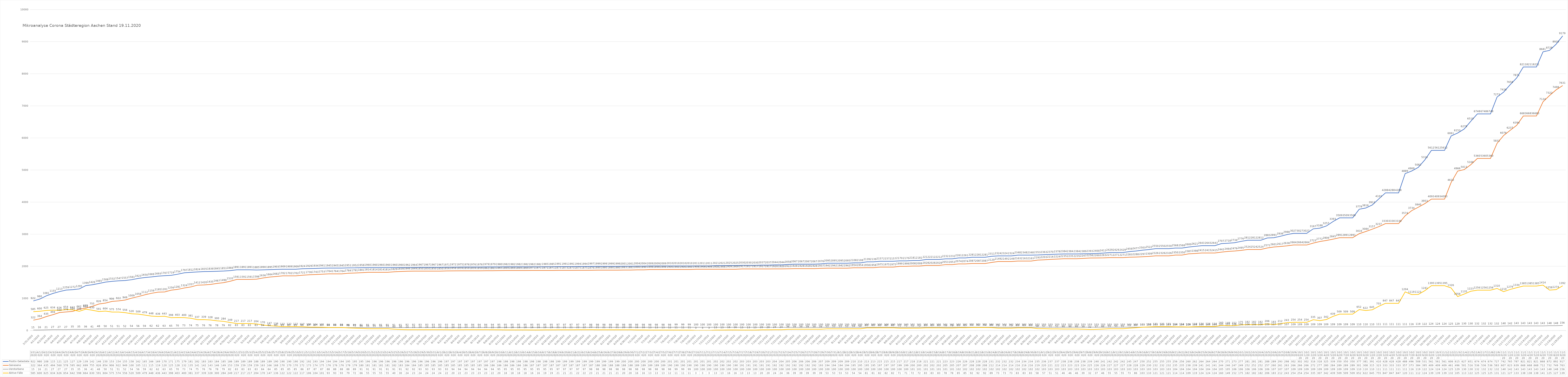
| Category | Positiv Getestete | Genesene | Verstorbene | Aktive Fälle |
|---|---|---|---|---|
| 3/31/20 | 922 | 322 | 15 | 585 |
| 4/1/20 | 980 | 364 | 16 | 600 |
| 4/2/20 | 1081 | 435 | 21 | 625 |
| 4/3/20 | 1155 | 494 | 27 | 634 |
| 4/4/20 | 1213 | 560 | 27 | 626 |
| 4/5/20 | 1259 | 578 | 27 | 654 |
| 4/6/20 | 1272 | 595 | 35 | 642 |
| 4/7/20 | 1295 | 662 | 35 | 598 |
| 4/8/20 | 1399 | 699 | 36 | 664 |
| 4/9/20 | 1426 | 755 | 41 | 630 |
| 4/10/20 | 1465 | 826 | 48 | 591 |
| 4/11/20 | 1508 | 854 | 50 | 604 |
| 4/12/20 | 1532 | 906 | 51 | 575 |
| 4/13/20 | 1547 | 922 | 51 | 574 |
| 4/14/20 | 1557 | 949 | 52 | 556 |
| 4/15/20 | 1583 | 1009 | 54 | 520 |
| 4/16/20 | 1623 | 1058 | 56 | 509 |
| 4/17/20 | 1650 | 1112 | 59 | 479 |
| 4/18/20 | 1669 | 1159 | 62 | 448 |
| 4/19/20 | 1693 | 1195 | 62 | 436 |
| 4/20/20 | 1707 | 1201 | 63 | 443 |
| 4/21/20 | 1719 | 1256 | 65 | 398 |
| 4/22/20 | 1754 | 1281 | 70 | 403 |
| 4/23/20 | 1797 | 1324 | 73 | 400 |
| 4/24/20 | 1812 | 1357 | 74 | 381 |
| 4/25/20 | 1824 | 1412 | 75 | 337 |
| 4/26/20 | 1835 | 1420 | 76 | 339 |
| 4/27/20 | 1839 | 1435 | 76 | 328 |
| 4/28/20 | 1845 | 1467 | 78 | 300 |
| 4/29/20 | 1853 | 1490 | 79 | 284 |
| 4/30/20 | 1866 | 1535 | 82 | 249 |
| 5/1/20 | 1891 | 1591 | 83 | 217 |
| 5/2/20 | 1891 | 1591 | 83 | 217 |
| 5/3/20 | 1891 | 1591 | 83 | 217 |
| 5/4/20 | 1885 | 1598 | 83 | 204 |
| 5/5/20 | 1890 | 1636 | 84 | 170 |
| 5/6/20 | 1895 | 1664 | 84 | 147 |
| 5/7/20 | 1903 | 1682 | 85 | 136 |
| 5/8/20 | 1909 | 1702 | 85 | 122 |
| 5/9/20 | 1909 | 1702 | 85 | 122 |
| 5/10/20 | 1909 | 1702 | 85 | 122 |
| 5/11/20 | 1924 | 1721 | 86 | 117 |
| 5/12/20 | 1929 | 1736 | 87 | 106 |
| 5/13/20 | 1934 | 1743 | 87 | 104 |
| 5/14/20 | 1941 | 1753 | 87 | 101 |
| 5/15/20 | 1945 | 1764 | 88 | 93 |
| 5/16/20 | 1945 | 1764 | 88 | 93 |
| 5/17/20 | 1945 | 1764 | 88 | 93 |
| 5/18/20 | 1951 | 1784 | 88 | 79 |
| 5/19/20 | 1952 | 1791 | 89 | 72 |
| 5/20/20 | 1958 | 1801 | 91 | 66 |
| 5/21/20 | 1960 | 1814 | 91 | 55 |
| 5/22/20 | 1960 | 1814 | 91 | 55 |
| 5/23/20 | 1960 | 1814 | 91 | 55 |
| 5/24/20 | 1960 | 1814 | 91 | 55 |
| 5/25/20 | 1960 | 1829 | 91 | 40 |
| 5/26/20 | 1960 | 1839 | 91 | 30 |
| 5/27/20 | 1962 | 1846 | 92 | 24 |
| 5/28/20 | 1964 | 1849 | 92 | 23 |
| 5/29/20 | 1967 | 1850 | 93 | 24 |
| 5/30/20 | 1967 | 1850 | 93 | 24 |
| 5/31/20 | 1967 | 1850 | 93 | 24 |
| 6/1/20 | 1967 | 1850 | 93 | 24 |
| 6/2/20 | 1971 | 1856 | 93 | 22 |
| 6/3/20 | 1972 | 1858 | 94 | 20 |
| 6/4/20 | 1975 | 1859 | 94 | 22 |
| 6/5/20 | 1976 | 1859 | 94 | 23 |
| 6/6/20 | 1976 | 1859 | 94 | 23 |
| 6/7/20 | 1976 | 1859 | 94 | 23 |
| 6/8/20 | 1979 | 1862 | 94 | 23 |
| 6/9/20 | 1979 | 1863 | 94 | 22 |
| 6/10/20 | 1980 | 1865 | 95 | 20 |
| 6/11/20 | 1982 | 1869 | 95 | 18 |
| 6/12/20 | 1982 | 1869 | 95 | 18 |
| 6/13/20 | 1982 | 1869 | 95 | 18 |
| 6/14/20 | 1982 | 1869 | 95 | 18 |
| 6/15/20 | 1982 | 1871 | 95 | 16 |
| 6/16/20 | 1982 | 1871 | 95 | 16 |
| 6/17/20 | 1985 | 1871 | 95 | 19 |
| 6/18/20 | 1985 | 1871 | 95 | 19 |
| 6/19/20 | 1991 | 1873 | 97 | 21 |
| 6/20/20 | 1991 | 1873 | 97 | 21 |
| 6/21/20 | 1991 | 1873 | 97 | 21 |
| 6/22/20 | 1994 | 1875 | 97 | 22 |
| 6/23/20 | 1994 | 1875 | 97 | 22 |
| 6/24/20 | 1997 | 1876 | 98 | 23 |
| 6/25/20 | 1999 | 1880 | 98 | 21 |
| 6/26/20 | 1999 | 1880 | 98 | 21 |
| 6/27/20 | 1999 | 1880 | 98 | 21 |
| 6/28/20 | 1999 | 1880 | 98 | 21 |
| 6/29/20 | 2001 | 1883 | 98 | 20 |
| 6/30/20 | 2001 | 1883 | 98 | 20 |
| 7/1/20 | 2004 | 1890 | 98 | 16 |
| 7/2/20 | 2004 | 1890 | 98 | 16 |
| 7/3/20 | 2009 | 1898 | 98 | 13 |
| 7/4/20 | 2009 | 1898 | 98 | 13 |
| 7/5/20 | 2009 | 1898 | 98 | 13 |
| 7/6/20 | 2010 | 1900 | 98 | 12 |
| 7/7/20 | 2010 | 1900 | 99 | 11 |
| 7/8/20 | 2010 | 1900 | 99 | 11 |
| 7/9/20 | 2010 | 1900 | 99 | 11 |
| 7/10/20 | 2011 | 1908 | 100 | 3 |
| 7/11/20 | 2011 | 1908 | 100 | 3 |
| 7/12/20 | 2011 | 1908 | 100 | 3 |
| 7/13/20 | 2021 | 1908 | 100 | 13 |
| 7/14/20 | 2021 | 1908 | 100 | 13 |
| 7/15/20 | 2025 | 1909 | 100 | 16 |
| 7/16/20 | 2025 | 1909 | 100 | 16 |
| 7/17/20 | 2030 | 1917 | 100 | 13 |
| 7/18/20 | 2030 | 1917 | 100 | 13 |
| 7/19/20 | 2030 | 1917 | 100 | 13 |
| 7/20/20 | 2037 | 1917 | 100 | 20 |
| 7/21/20 | 2037 | 1917 | 100 | 20 |
| 7/22/20 | 2044 | 1920 | 100 | 24 |
| 7/23/20 | 2044 | 1920 | 100 | 24 |
| 7/24/20 | 2058 | 1922 | 100 | 36 |
| 7/25/20 | 2067 | 1928 | 100 | 39 |
| 7/26/20 | 2067 | 1928 | 100 | 39 |
| 7/27/20 | 2067 | 1928 | 100 | 39 |
| 7/28/20 | 2067 | 1928 | 100 | 39 |
| 7/29/20 | 2076 | 1937 | 100 | 39 |
| 7/30/20 | 2095 | 1942 | 100 | 53 |
| 7/31/20 | 2095 | 1942 | 100 | 53 |
| 8/1/20 | 2095 | 1942 | 100 | 53 |
| 8/2/20 | 2095 | 1942 | 100 | 53 |
| 8/3/20 | 2108 | 1954 | 100 | 54 |
| 8/4/20 | 2108 | 1954 | 100 | 54 |
| 8/5/20 | 2139 | 1958 | 100 | 81 |
| 8/6/20 | 2139 | 1958 | 100 | 81 |
| 8/7/20 | 2157 | 1975 | 100 | 82 |
| 8/8/20 | 2157 | 1975 | 100 | 82 |
| 8/9/20 | 2157 | 1975 | 100 | 82 |
| 8/10/20 | 2170 | 1999 | 100 | 71 |
| 8/11/20 | 2170 | 1999 | 100 | 71 |
| 8/12/20 | 2181 | 2008 | 101 | 72 |
| 8/13/20 | 2181 | 2008 | 101 | 72 |
| 8/14/20 | 2212 | 2028 | 101 | 83 |
| 8/15/20 | 2212 | 2028 | 101 | 83 |
| 8/16/20 | 2212 | 2028 | 101 | 83 |
| 8/17/20 | 2232 | 2053 | 101 | 78 |
| 8/18/20 | 2232 | 2053 | 101 | 78 |
| 8/19/20 | 2261 | 2074 | 102 | 85 |
| 8/20/20 | 2261 | 2074 | 102 | 85 |
| 8/21/20 | 2281 | 2087 | 102 | 92 |
| 8/22/20 | 2281 | 2087 | 102 | 92 |
| 8/23/20 | 2281 | 2087 | 102 | 92 |
| 8/24/20 | 2311 | 2120 | 102 | 89 |
| 8/25/20 | 2324 | 2149 | 102 | 73 |
| 8/26/20 | 2324 | 2149 | 102 | 73 |
| 8/27/20 | 2324 | 2149 | 102 | 73 |
| 8/28/20 | 2348 | 2163 | 102 | 83 |
| 8/29/20 | 2348 | 2163 | 102 | 83 |
| 8/30/20 | 2348 | 2163 | 102 | 83 |
| 8/31/20 | 2353 | 2193 | 102 | 58 |
| 9/1/20 | 2363 | 2203 | 103 | 57 |
| 9/2/20 | 2370 | 2216 | 103 | 51 |
| 9/3/20 | 2378 | 2224 | 103 | 51 |
| 9/4/20 | 2384 | 2235 | 103 | 46 |
| 9/5/20 | 2384 | 2235 | 103 | 46 |
| 9/6/20 | 2384 | 2235 | 103 | 46 |
| 9/7/20 | 2389 | 2247 | 103 | 39 |
| 9/8/20 | 2393 | 2258 | 103 | 32 |
| 9/9/20 | 2400 | 2260 | 103 | 37 |
| 9/10/20 | 2412 | 2263 | 103 | 46 |
| 9/11/20 | 2429 | 2271 | 103 | 55 |
| 9/12/20 | 2429 | 2271 | 103 | 55 |
| 9/13/20 | 2429 | 2271 | 103 | 55 |
| 9/14/20 | 2459 | 2283 | 103 | 73 |
| 9/15/20 | 2477 | 2288 | 103 | 86 |
| 9/16/20 | 2503 | 2297 | 103 | 103 |
| 9/17/20 | 2522 | 2309 | 103 | 110 |
| 9/18/20 | 2550 | 2326 | 103 | 121 |
| 9/19/20 | 2550 | 2326 | 103 | 121 |
| 9/20/20 | 2550 | 2326 | 103 | 121 |
| 9/21/20 | 2568 | 2350 | 104 | 114 |
| 9/22/20 | 2568 | 2350 | 104 | 114 |
| 9/23/20 | 2600 | 2387 | 104 | 109 |
| 9/24/20 | 2621 | 2398 | 104 | 119 |
| 9/25/20 | 2643 | 2415 | 104 | 124 |
| 9/26/20 | 2643 | 2415 | 104 | 124 |
| 9/27/20 | 2643 | 2415 | 104 | 124 |
| 9/28/20 | 2707 | 2442 | 105 | 160 |
| 9/29/20 | 2718 | 2464 | 105 | 149 |
| 9/30/20 | 2734 | 2476 | 106 | 152 |
| 10/1/20 | 2776 | 2495 | 106 | 175 |
| 10/2/20 | 2812 | 2524 | 106 | 182 |
| 10/3/20 | 2812 | 2524 | 106 | 182 |
| 10/4/20 | 2812 | 2524 | 106 | 182 |
| 10/5/20 | 2883 | 2571 | 106 | 206 |
| 10/6/20 | 2891 | 2601 | 107 | 183 |
| 10/7/20 | 2936 | 2617 | 107 | 212 |
| 10/8/20 | 2988 | 2638 | 107 | 243 |
| 10/9/20 | 3027 | 2664 | 109 | 254 |
| 10/10/20 | 3027 | 2664 | 109 | 254 |
| 10/11/20 | 3027 | 2664 | 109 | 254 |
| 10/12/20 | 3167 | 2723 | 109 | 335 |
| 10/13/20 | 3188 | 2772 | 109 | 307 |
| 10/14/20 | 3257 | 2806 | 109 | 342 |
| 10/15/20 | 3393 | 2845 | 109 | 439 |
| 10/16/20 | 3509 | 2891 | 109 | 509 |
| 10/17/20 | 3509 | 2891 | 109 | 509 |
| 10/18/20 | 3509 | 2891 | 109 | 509 |
| 10/19/20 | 3778 | 3016 | 110 | 652 |
| 10/20/20 | 3816 | 3084 | 110 | 622 |
| 10/21/20 | 3912 | 3157 | 110 | 645 |
| 10/22/20 | 4103 | 3237 | 111 | 755 |
| 10/23/20 | 4288 | 3330 | 111 | 847 |
| 10/24/20 | 4288 | 3330 | 111 | 847 |
| 10/25/20 | 4288 | 3330 | 111 | 847 |
| 10/26/20 | 4889 | 3574 | 111 | 1204 |
| 10/27/20 | 4969 | 3734 | 116 | 1119 |
| 10/28/20 | 5082 | 3840 | 119 | 1123 |
| 10/29/20 | 5316 | 3953 | 122 | 1241 |
| 10/30/20 | 5612 | 4093 | 124 | 1395 |
| 10/31/20 | 5612 | 4093 | 124 | 1395 |
| 11/1/20 | 5612 | 4093 | 124 | 1395 |
| 11/2/20 | 6061 | 4610 | 125 | 1326 |
| 11/3/20 | 6153 | 4966 | 129 | 1058 |
| 11/4/20 | 6278 | 5013 | 130 | 1135 |
| 11/5/20 | 6519 | 5166 | 130 | 1223 |
| 11/6/20 | 6748 | 5360 | 132 | 1256 |
| 11/7/20 | 6748 | 5360 | 132 | 1256 |
| 11/8/20 | 6748 | 5360 | 132 | 1256 |
| 11/9/20 | 7273 | 5831 | 132 | 1310 |
| 11/10/20 | 7426 | 6076 | 140 | 1210 |
| 11/11/20 | 7658 | 6237 | 142 | 1279 |
| 11/12/20 | 7871 | 6394 | 143 | 1334 |
| 11/13/20 | 8211 | 6683 | 143 | 1385 |
| 11/14/20 | 8211 | 6683 | 143 | 1385 |
| 11/15/20 | 8211 | 6683 | 143 | 1385 |
| 11/16/20 | 8681 | 7124 | 143 | 1414 |
| 11/17/20 | 8728 | 7322 | 148 | 1258 |
| 11/18/20 | 8920 | 7498 | 148 | 1274 |
| 11/19/20 | 9179 | 7631 | 156 | 1392 |